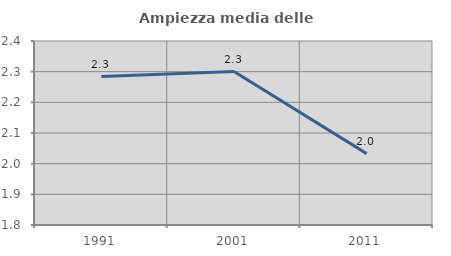
| Category | Ampiezza media delle famiglie |
|---|---|
| 1991.0 | 2.284 |
| 2001.0 | 2.3 |
| 2011.0 | 2.033 |